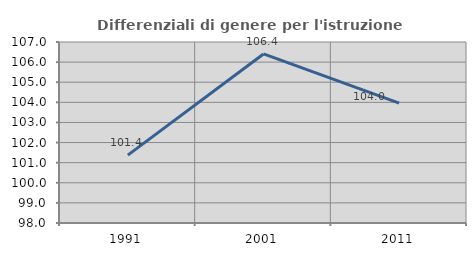
| Category | Differenziali di genere per l'istruzione superiore |
|---|---|
| 1991.0 | 101.374 |
| 2001.0 | 106.406 |
| 2011.0 | 103.957 |